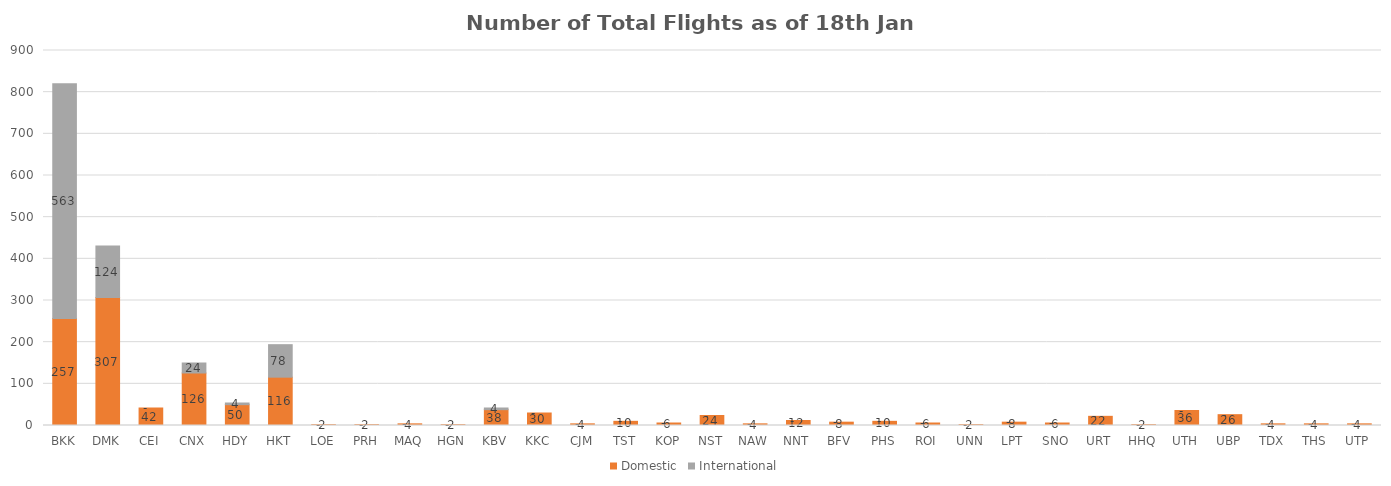
| Category | Domestic | International |
|---|---|---|
| BKK | 257 | 563 |
| DMK | 307 | 124 |
| CEI | 42 | 0 |
| CNX | 126 | 24 |
| HDY | 50 | 4 |
| HKT | 116 | 78 |
| LOE | 2 | 0 |
| PRH | 2 | 0 |
| MAQ | 4 | 0 |
| HGN | 2 | 0 |
| KBV | 38 | 4 |
| KKC | 30 | 0 |
| CJM | 4 | 0 |
| TST | 10 | 0 |
| KOP | 6 | 0 |
| NST | 24 | 0 |
| NAW | 4 | 0 |
| NNT | 12 | 0 |
| BFV | 8 | 0 |
| PHS | 10 | 0 |
| ROI | 6 | 0 |
| UNN | 2 | 0 |
| LPT | 8 | 0 |
| SNO | 6 | 0 |
| URT | 22 | 0 |
| HHQ | 2 | 0 |
| UTH | 36 | 0 |
| UBP | 26 | 0 |
| TDX | 4 | 0 |
| THS | 4 | 0 |
| UTP | 4 | 0 |